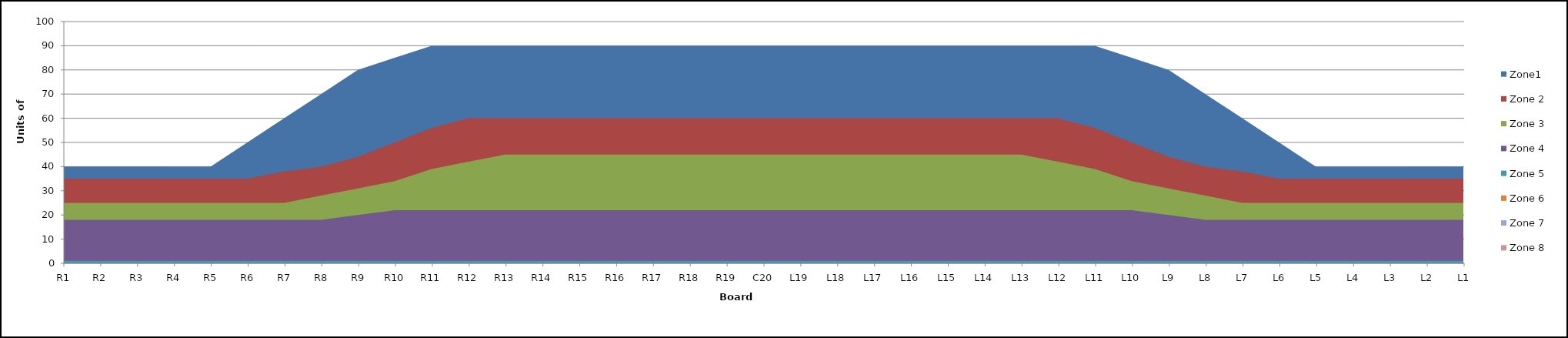
| Category | Zone1 | Zone 2 | Zone 3 | Zone 4 | Zone 5 | Zone 6 | Zone 7 | Zone 8 |
|---|---|---|---|---|---|---|---|---|
| L1 | 40 | 35 | 25 | 18 | 1 |  |  |  |
| L2 | 40 | 35 | 25 | 18 | 1 |  |  |  |
| L3 | 40 | 35 | 25 | 18 | 1 |  |  |  |
| L4 | 40 | 35 | 25 | 18 | 1 |  |  |  |
| L5 | 40 | 35 | 25 | 18 | 1 |  |  |  |
| L6 | 50 | 35 | 25 | 18 | 1 |  |  |  |
| L7 | 60 | 38 | 25 | 18 | 1 |  |  |  |
| L8 | 70 | 40 | 28 | 18 | 1 |  |  |  |
| L9 | 80 | 44 | 31 | 20 | 1 |  |  |  |
| L10 | 85 | 50 | 34 | 22 | 1 |  |  |  |
| L11 | 90 | 56 | 39 | 22 | 1 |  |  |  |
| L12 | 90 | 60 | 42 | 22 | 1 |  |  |  |
| L13 | 90 | 60 | 45 | 22 | 1 |  |  |  |
| L14 | 90 | 60 | 45 | 22 | 1 |  |  |  |
| L15 | 90 | 60 | 45 | 22 | 1 |  |  |  |
| L16 | 90 | 60 | 45 | 22 | 1 |  |  |  |
| L17 | 90 | 60 | 45 | 22 | 1 |  |  |  |
| L18 | 90 | 60 | 45 | 22 | 1 |  |  |  |
| L19 | 90 | 60 | 45 | 22 | 1 |  |  |  |
| C20 | 90 | 60 | 45 | 22 | 1 |  |  |  |
| R19 | 90 | 60 | 45 | 22 | 1 |  |  |  |
| R18 | 90 | 60 | 45 | 22 | 1 |  |  |  |
| R17 | 90 | 60 | 45 | 22 | 1 |  |  |  |
| R16 | 90 | 60 | 45 | 22 | 1 |  |  |  |
| R15 | 90 | 60 | 45 | 22 | 1 |  |  |  |
| R14 | 90 | 60 | 45 | 22 | 1 |  |  |  |
| R13 | 90 | 60 | 45 | 22 | 1 |  |  |  |
| R12 | 90 | 60 | 42 | 22 | 1 |  |  |  |
| R11 | 90 | 56 | 39 | 22 | 1 |  |  |  |
| R10 | 85 | 50 | 34 | 22 | 1 |  |  |  |
| R9 | 80 | 44 | 31 | 20 | 1 |  |  |  |
| R8 | 70 | 40 | 28 | 18 | 1 |  |  |  |
| R7 | 60 | 38 | 25 | 18 | 1 |  |  |  |
| R6 | 50 | 35 | 25 | 18 | 1 |  |  |  |
| R5 | 40 | 35 | 25 | 18 | 1 |  |  |  |
| R4 | 40 | 35 | 25 | 18 | 1 |  |  |  |
| R3 | 40 | 35 | 25 | 18 | 1 |  |  |  |
| R2 | 40 | 35 | 25 | 18 | 1 |  |  |  |
| R1 | 40 | 35 | 25 | 18 | 1 |  |  |  |